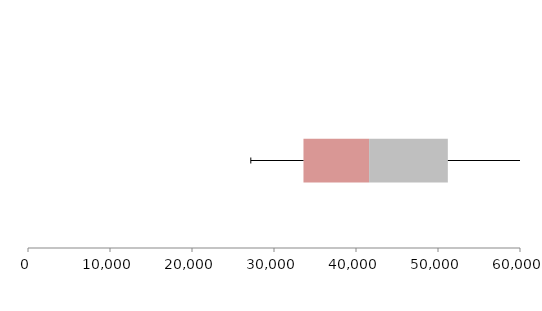
| Category | Series 1 | Series 2 | Series 3 |
|---|---|---|---|
| 0 | 33595.09 | 8001.573 | 9602.366 |